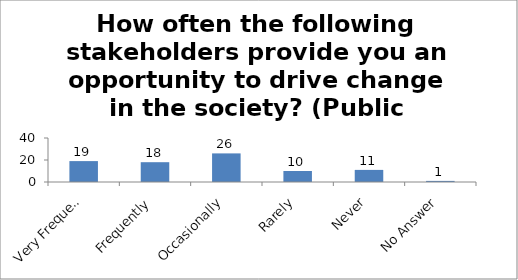
| Category | How often the following stakeholders provide you an opportunity to drive change in the society? (Public Institutions) |
|---|---|
| Very Frequently | 19 |
| Frequently | 18 |
| Occasionally | 26 |
| Rarely | 10 |
| Never | 11 |
| No Answer | 1 |